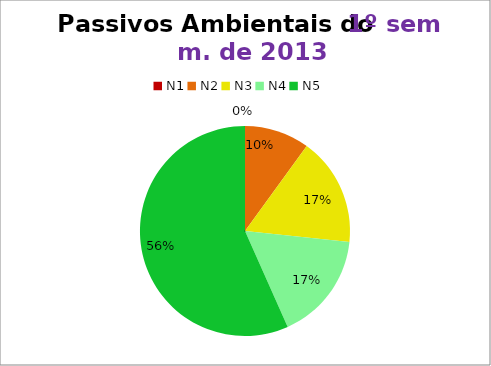
| Category | 1º/13 |
|---|---|
| N1 | 0 |
| N2 | 3 |
| N3 | 5 |
| N4 | 5 |
| N5 | 17 |